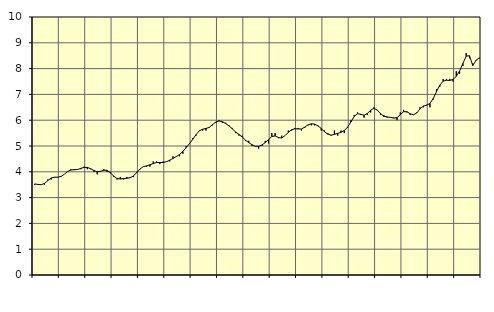
| Category | Piggar | Information och kommunikation, SNI 58-63 |
|---|---|---|
| nan | 3.5 | 3.53 |
| 87.0 | 3.5 | 3.51 |
| 87.0 | 3.5 | 3.5 |
| 87.0 | 3.5 | 3.55 |
| nan | 3.7 | 3.66 |
| 88.0 | 3.7 | 3.76 |
| 88.0 | 3.8 | 3.79 |
| 88.0 | 3.8 | 3.79 |
| nan | 3.8 | 3.82 |
| 89.0 | 3.9 | 3.9 |
| 89.0 | 4 | 4.01 |
| 89.0 | 4.1 | 4.07 |
| nan | 4.1 | 4.08 |
| 90.0 | 4.1 | 4.09 |
| 90.0 | 4.1 | 4.13 |
| 90.0 | 4.2 | 4.17 |
| nan | 4.1 | 4.17 |
| 91.0 | 4.1 | 4.12 |
| 91.0 | 4 | 4.05 |
| 91.0 | 3.9 | 4 |
| nan | 4 | 4.02 |
| 92.0 | 4.1 | 4.06 |
| 92.0 | 4 | 4.06 |
| 92.0 | 4 | 3.96 |
| nan | 3.8 | 3.83 |
| 93.0 | 3.7 | 3.74 |
| 93.0 | 3.8 | 3.72 |
| 93.0 | 3.7 | 3.74 |
| nan | 3.8 | 3.75 |
| 94.0 | 3.8 | 3.77 |
| 94.0 | 3.8 | 3.84 |
| 94.0 | 4 | 3.97 |
| nan | 4.1 | 4.11 |
| 95.0 | 4.2 | 4.2 |
| 95.0 | 4.2 | 4.23 |
| 95.0 | 4.2 | 4.27 |
| nan | 4.4 | 4.32 |
| 96.0 | 4.4 | 4.36 |
| 96.0 | 4.3 | 4.36 |
| 96.0 | 4.4 | 4.36 |
| nan | 4.4 | 4.39 |
| 97.0 | 4.4 | 4.45 |
| 97.0 | 4.6 | 4.52 |
| 97.0 | 4.6 | 4.59 |
| nan | 4.6 | 4.67 |
| 98.0 | 4.7 | 4.79 |
| 98.0 | 5 | 4.94 |
| 98.0 | 5.1 | 5.09 |
| nan | 5.3 | 5.26 |
| 99.0 | 5.4 | 5.44 |
| 99.0 | 5.6 | 5.59 |
| 99.0 | 5.6 | 5.65 |
| nan | 5.6 | 5.68 |
| 0.0 | 5.7 | 5.72 |
| 0.0 | 5.8 | 5.83 |
| 0.0 | 5.9 | 5.93 |
| nan | 6 | 5.97 |
| 1.0 | 5.9 | 5.94 |
| 1.0 | 5.9 | 5.87 |
| 1.0 | 5.8 | 5.78 |
| nan | 5.7 | 5.67 |
| 2.0 | 5.5 | 5.54 |
| 2.0 | 5.4 | 5.45 |
| 2.0 | 5.4 | 5.35 |
| nan | 5.2 | 5.23 |
| 3.0 | 5.2 | 5.13 |
| 3.0 | 5 | 5.05 |
| 3.0 | 5 | 4.99 |
| nan | 4.9 | 4.99 |
| 4.0 | 5 | 5.04 |
| 4.0 | 5.2 | 5.13 |
| 4.0 | 5.1 | 5.25 |
| nan | 5.5 | 5.37 |
| 5.0 | 5.5 | 5.39 |
| 5.0 | 5.3 | 5.33 |
| 5.0 | 5.4 | 5.31 |
| nan | 5.4 | 5.4 |
| 6.0 | 5.6 | 5.53 |
| 6.0 | 5.6 | 5.63 |
| 6.0 | 5.7 | 5.67 |
| nan | 5.7 | 5.66 |
| 7.0 | 5.6 | 5.66 |
| 7.0 | 5.7 | 5.73 |
| 7.0 | 5.8 | 5.82 |
| nan | 5.8 | 5.86 |
| 8.0 | 5.8 | 5.85 |
| 8.0 | 5.8 | 5.78 |
| 8.0 | 5.6 | 5.68 |
| nan | 5.6 | 5.55 |
| 9.0 | 5.5 | 5.46 |
| 9.0 | 5.4 | 5.42 |
| 9.0 | 5.6 | 5.45 |
| nan | 5.4 | 5.49 |
| 10.0 | 5.6 | 5.53 |
| 10.0 | 5.5 | 5.6 |
| 10.0 | 5.7 | 5.73 |
| nan | 6 | 5.93 |
| 11.0 | 6.2 | 6.15 |
| 11.0 | 6.3 | 6.25 |
| 11.0 | 6.2 | 6.23 |
| nan | 6.1 | 6.19 |
| 12.0 | 6.2 | 6.26 |
| 12.0 | 6.3 | 6.39 |
| 12.0 | 6.5 | 6.46 |
| nan | 6.4 | 6.39 |
| 13.0 | 6.2 | 6.26 |
| 13.0 | 6.2 | 6.15 |
| 13.0 | 6.1 | 6.13 |
| nan | 6.1 | 6.11 |
| 14.0 | 6.1 | 6.08 |
| 14.0 | 6 | 6.1 |
| 14.0 | 6.3 | 6.21 |
| nan | 6.4 | 6.33 |
| 15.0 | 6.3 | 6.33 |
| 15.0 | 6.2 | 6.25 |
| 15.0 | 6.2 | 6.21 |
| nan | 6.3 | 6.28 |
| 16.0 | 6.5 | 6.44 |
| 16.0 | 6.5 | 6.55 |
| 16.0 | 6.6 | 6.58 |
| nan | 6.5 | 6.65 |
| 17.0 | 6.8 | 6.84 |
| 17.0 | 7.2 | 7.11 |
| 17.0 | 7.3 | 7.36 |
| nan | 7.6 | 7.51 |
| 18.0 | 7.6 | 7.55 |
| 18.0 | 7.6 | 7.54 |
| 18.0 | 7.5 | 7.58 |
| nan | 7.9 | 7.7 |
| 19.0 | 7.8 | 7.91 |
| 19.0 | 8.1 | 8.2 |
| 19.0 | 8.6 | 8.48 |
| nan | 8.4 | 8.5 |
| 20.0 | 8.2 | 8.12 |
| 20.0 | 8.3 | 8.32 |
| 20.0 | 8.4 | 8.42 |